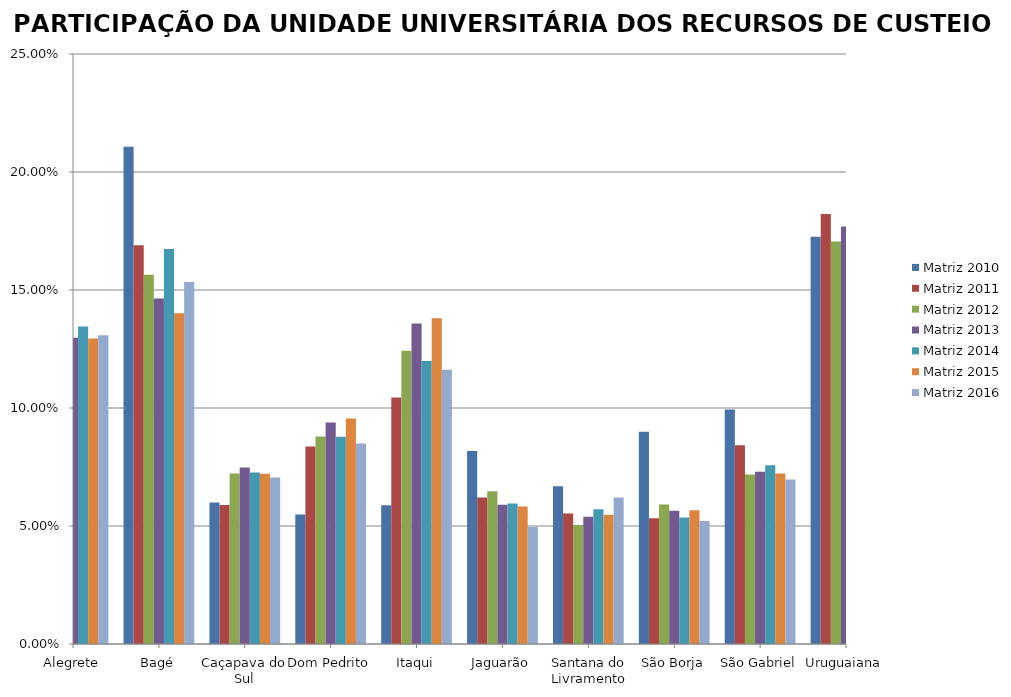
| Category | Matriz 2010 | Matriz 2011 | Matriz 2012 | Matriz 2013 | Matriz 2014 | Matriz 2015 | Matriz 2016 |
|---|---|---|---|---|---|---|---|
| Alegrete | 0.105 | 0.136 | 0.143 | 0.13 | 0.134 | 0.129 | 0.131 |
| Bagé | 0.211 | 0.169 | 0.156 | 0.146 | 0.167 | 0.14 | 0.153 |
| Caçapava do Sul | 0.06 | 0.059 | 0.072 | 0.075 | 0.073 | 0.072 | 0.071 |
| Dom Pedrito | 0.055 | 0.084 | 0.088 | 0.094 | 0.088 | 0.096 | 0.085 |
| Itaqui | 0.059 | 0.104 | 0.124 | 0.136 | 0.12 | 0.138 | 0.116 |
| Jaguarão | 0.082 | 0.062 | 0.065 | 0.059 | 0.06 | 0.058 | 0.05 |
| Santana do Livramento | 0.067 | 0.055 | 0.05 | 0.054 | 0.057 | 0.055 | 0.062 |
| São Borja | 0.09 | 0.053 | 0.059 | 0.056 | 0.054 | 0.057 | 0.052 |
| São Gabriel | 0.099 | 0.084 | 0.072 | 0.073 | 0.076 | 0.072 | 0.07 |
| Uruguaiana | 0.173 | 0.182 | 0.17 | 0.177 | 0.172 | 0.183 | 0.211 |